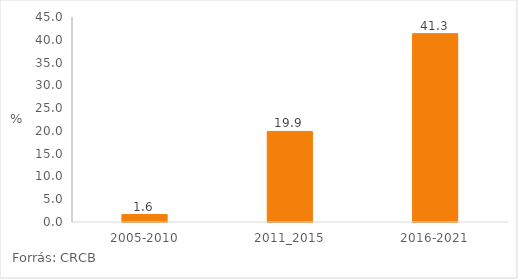
| Category | Series 0 |
|---|---|
| 2005-2010 | 1.637 |
| 2011_2015 | 19.882 |
| 2016-2021 | 41.339 |